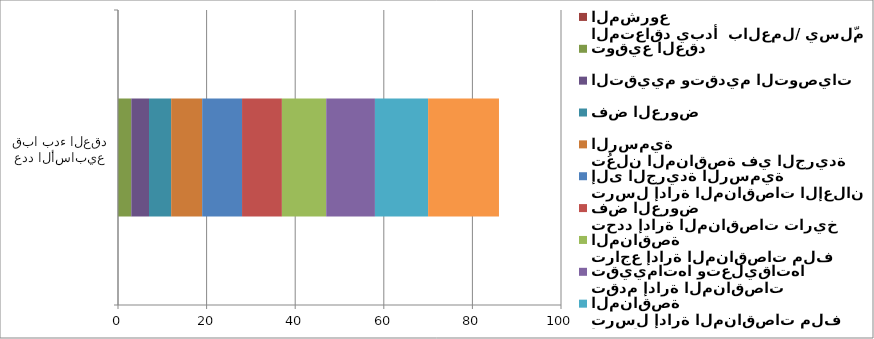
| Category | المتعاقد يبدأ  بالعمل/ يسلّم المشروع | توقيع العقد | التقييم وتقديم التوصيات | فض العروض | تُعلن المناقصة في الجريدة الرسمية | ترسل إدارة المناقصات الإعلان إلى الجريدة الرسمية | تحدد إدارة المناقصات تاريخ فض العروض | تراجع إدارة المناقصات ملف المناقصة | تقدم إدارة المناقصات تقييماتها وتعليقاتها | ترسل إدارة المناقصات ملف المناقصة |  تُعدّ المشتريات والصفقات في الجهة المتعاقدة ملف المناقصة |
|---|---|---|---|---|---|---|---|---|---|---|---|
| عدد الأسابيع قبا بدء العقد | 0 | 3 | 4 | 5 | 7 | 9 | 9 | 10 | 11 | 12 | 16 |